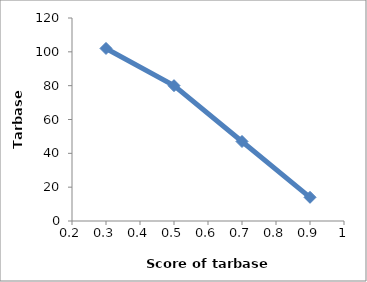
| Category | Series 0 |
|---|---|
| 0.3 | 102 |
| 0.5 | 80 |
| 0.7 | 47 |
| 0.9 | 14 |